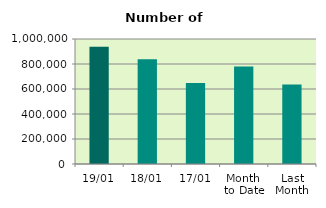
| Category | Series 0 |
|---|---|
| 19/01 | 937366 |
| 18/01 | 837078 |
| 17/01 | 648830 |
| Month 
to Date | 780238.769 |
| Last
Month | 635205.478 |